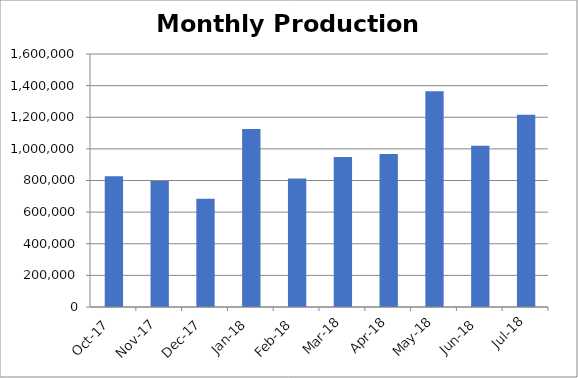
| Category | Series 0 |
|---|---|
| 2017-10-01 | 826096.917 |
| 2017-11-01 | 797045.5 |
| 2017-12-01 | 684479.122 |
| 2018-01-01 | 1125801.25 |
| 2018-02-01 | 812648.5 |
| 2018-03-01 | 947868 |
| 2018-04-01 | 967041 |
| 2018-05-01 | 1364954 |
| 2018-06-01 | 1019579 |
| 2018-07-01 | 1215828 |